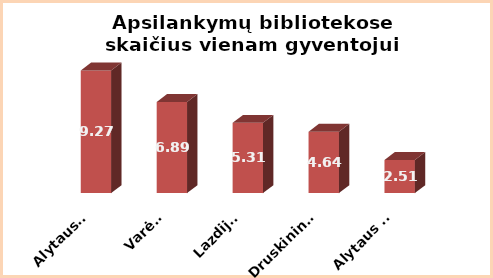
| Category | Series 0 |
|---|---|
| Alytaus r. | 9.27 |
| Varėna | 6.89 |
| Lazdijai | 5.31 |
| Druskininkai | 4.64 |
| Alytaus m. | 2.51 |